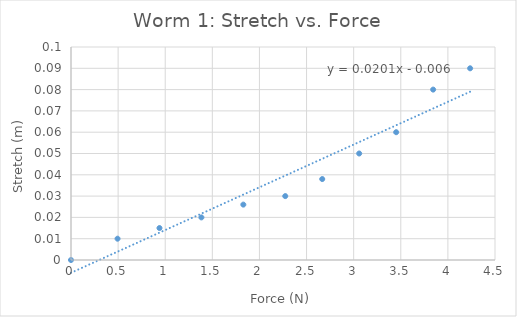
| Category | Series 0 |
|---|---|
| 0.0 | 0 |
| 0.49403159999999996 | 0.01 |
| 0.9390132 | 0.015 |
| 1.3839948 | 0.02 |
| 1.8289764 | 0.026 |
| 2.2739580000000004 | 0.03 |
| 2.666358 | 0.038 |
| 3.0587580000000005 | 0.05 |
| 3.4511580000000004 | 0.06 |
| 3.8435580000000007 | 0.08 |
| 4.235958 | 0.09 |